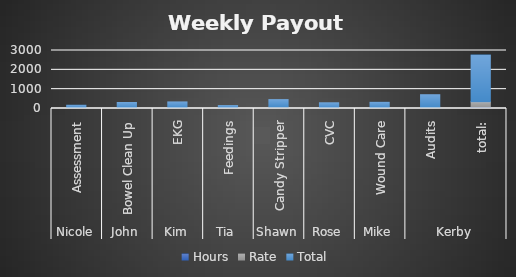
| Category | Hours |  Rate  |  Total  |
|---|---|---|---|
| 0 | 8 | 18 | 144 |
| 1 | 12 | 23 | 276 |
| 2 | 10 | 30 | 300 |
| 3 | 8 | 16 | 128 |
| 4 | 6 | 65 | 390 |
| 5 | 8 | 32 | 256 |
| 6 | 6 | 45 | 270 |
| 7 | 13 | 50 | 650 |
| 8 | 71 | 279 | 2414 |